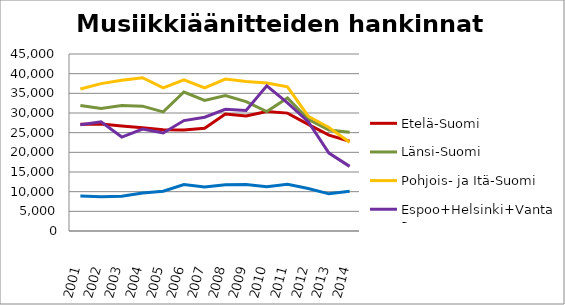
| Category | Etelä-Suomi | Länsi-Suomi | Pohjois- ja Itä-Suomi | Espoo+Helsinki+Vantaa | Muu Uusimaa |
|---|---|---|---|---|---|
| 2001.0 | 27127 | 31932 | 36100 | 27027 | 8926 |
| 2002.0 | 27213 | 31127 | 37475 | 27743 | 8704 |
| 2003.0 | 26689 | 31932 | 38324 | 23889 | 8810 |
| 2004.0 | 26238 | 31738 | 38971 | 25926 | 9668 |
| 2005.0 | 25718 | 30278 | 36369 | 24916 | 10126 |
| 2006.0 | 25651 | 35330 | 38413 | 28077 | 11813 |
| 2007.0 | 26097 | 33200 | 36366 | 28921 | 11166 |
| 2008.0 | 29738 | 34450 | 38619 | 30935 | 11729 |
| 2009.0 | 29262 | 32916 | 38021 | 30661 | 11812 |
| 2010.0 | 30366 | 30374 | 37610 | 36924 | 11274 |
| 2011.0 | 29971 | 33841 | 36666 | 32571 | 11900 |
| 2012.0 | 27097 | 28409 | 29184 | 27776 | 10824 |
| 2013.0 | 24382 | 25671 | 26304 | 19818 | 9446 |
| 2014.0 | 22821 | 25129 | 22564 | 16432 | 10129 |